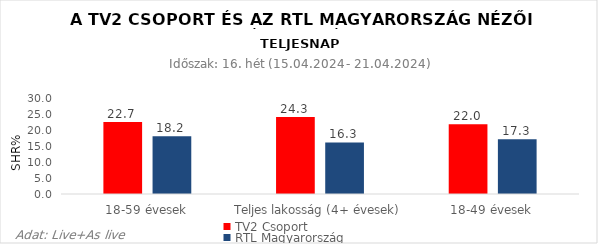
| Category | TV2 Csoport | RTL Magyarország |
|---|---|---|
| 18-59 évesek | 22.7 | 18.2 |
| Teljes lakosság (4+ évesek) | 24.3 | 16.3 |
| 18-49 évesek | 22 | 17.3 |